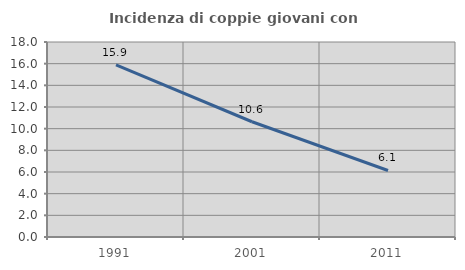
| Category | Incidenza di coppie giovani con figli |
|---|---|
| 1991.0 | 15.894 |
| 2001.0 | 10.638 |
| 2011.0 | 6.14 |